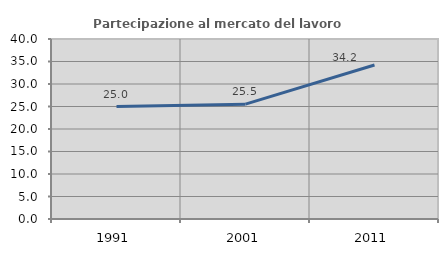
| Category | Partecipazione al mercato del lavoro  femminile |
|---|---|
| 1991.0 | 25 |
| 2001.0 | 25.514 |
| 2011.0 | 34.232 |